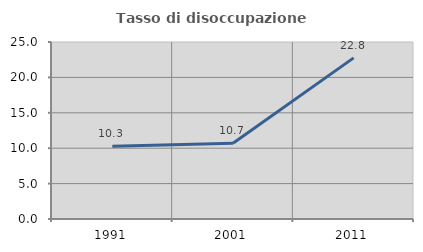
| Category | Tasso di disoccupazione giovanile  |
|---|---|
| 1991.0 | 10.276 |
| 2001.0 | 10.69 |
| 2011.0 | 22.759 |